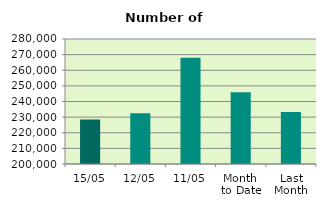
| Category | Series 0 |
|---|---|
| 15/05 | 228458 |
| 12/05 | 232414 |
| 11/05 | 267986 |
| Month 
to Date | 245994.4 |
| Last
Month | 233247 |